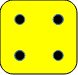
| Category | Series 0 |
|---|---|
| 0.1 | 0.1 |
| 0.1 | 0.1 |
| 0.1 | 0.9 |
| 0.9 | 0.1 |
| 0.9 | 0.9 |
| 0.9 | 0.9 |